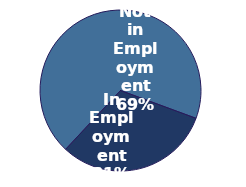
| Category | Series 0 |
|---|---|
| Not in Employment | 0.687 |
| In Employment | 0.313 |